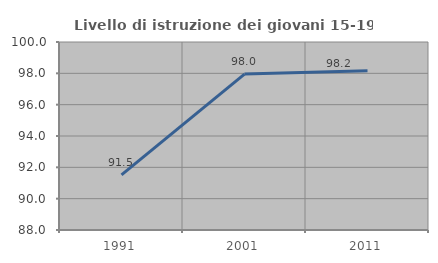
| Category | Livello di istruzione dei giovani 15-19 anni |
|---|---|
| 1991.0 | 91.518 |
| 2001.0 | 97.955 |
| 2011.0 | 98.158 |